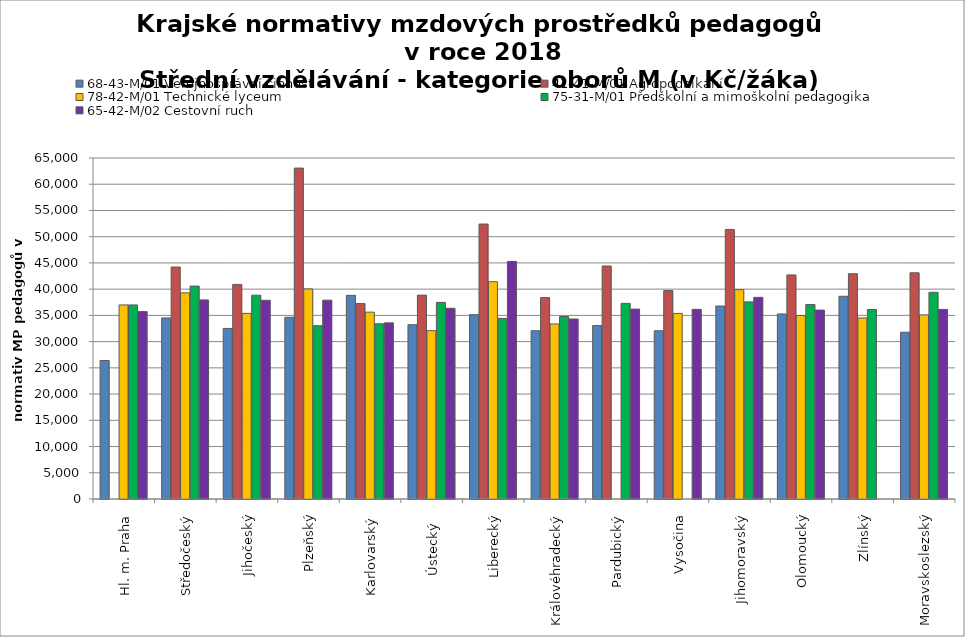
| Category | 68-43-M/01 Veřejnosprávní činnost | 41-41-M/01 Agropodnikání | 78-42-M/01 Technické lyceum | 75-31-M/01 Předškolní a mimoškolní pedagogika | 65-42-M/02 Cestovní ruch |
|---|---|---|---|---|---|
| Hl. m. Praha | 26392.357 | 0 | 36996.429 | 36996.429 | 35720.69 |
| Středočeský | 34515.744 | 44215.769 | 39293.958 | 40580.251 | 37951.869 |
| Jihočeský | 32509.96 | 40903.302 | 35385.95 | 38857.143 | 37878.306 |
| Plzeňský | 34647.346 | 63077.301 | 40045.18 | 33033.253 | 37904.516 |
| Karlovarský  | 38816.327 | 37257.591 | 35617.978 | 33397.717 | 33574.581 |
| Ústecký   | 33219.718 | 38864.676 | 32089.796 | 37475.273 | 36356.069 |
| Liberecký | 35134.523 | 52412.261 | 41419.318 | 34422.181 | 45275.292 |
| Královéhradecký | 32080.513 | 38391.939 | 33368.687 | 34786.435 | 34309.091 |
| Pardubický | 33065.89 | 44408.045 | 0 | 37284.428 | 36197.814 |
| Vysočina | 32062.219 | 39728.794 | 35371.777 | 0 | 36146.341 |
| Jihomoravský | 36780.666 | 51382.149 | 39904.202 | 37574.316 | 38437.453 |
| Olomoucký | 35272.417 | 42713.547 | 34973.751 | 37077.199 | 36010.462 |
| Zlínský | 38643.6 | 42937.333 | 34503.214 | 36115.514 | 0 |
| Moravskoslezský | 31788.506 | 43122.661 | 35096.447 | 39396.011 | 36135.889 |